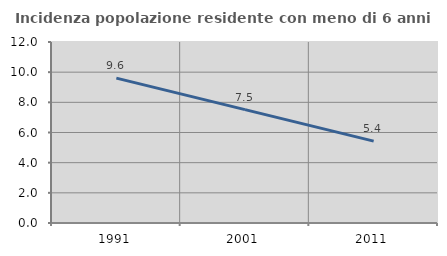
| Category | Incidenza popolazione residente con meno di 6 anni |
|---|---|
| 1991.0 | 9.608 |
| 2001.0 | 7.515 |
| 2011.0 | 5.43 |